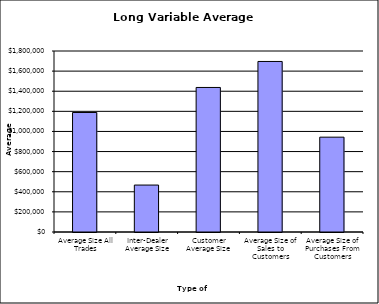
| Category | Security Type |
|---|---|
| Average Size All Trades | 1188512.886 |
| Inter-Dealer Average Size | 466803.922 |
| Customer Average Size | 1437378.047 |
| Average Size of Sales to Customers | 1695962.522 |
| Average Size of Purchases From Customers | 943115.201 |